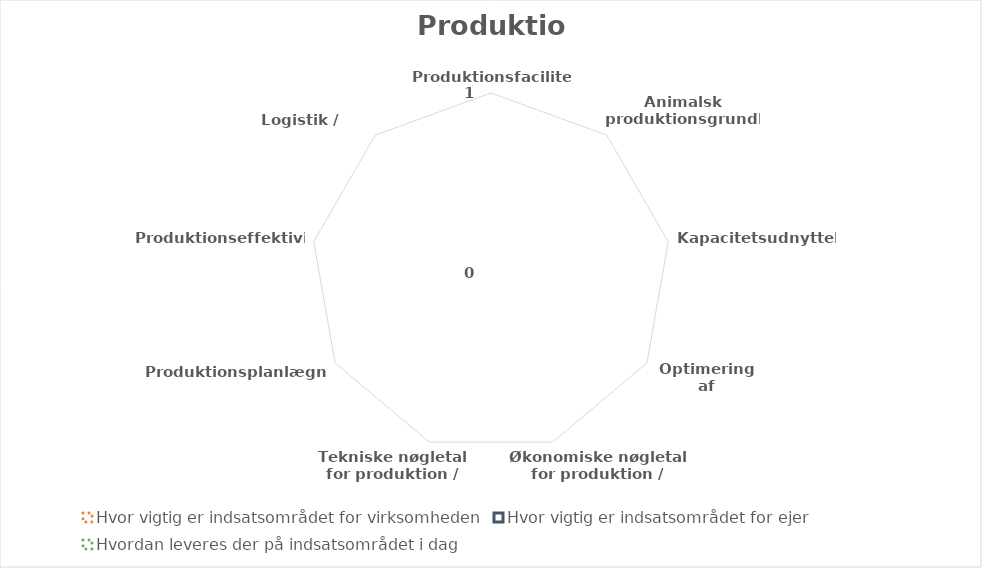
| Category | Hvor vigtig er indsatsområdet for virksomheden | Hvor vigtig er indsatsområdet for ejer | Hvordan leveres der på indsatsområdet i dag |
|---|---|---|---|
| Produktionsfaciliteter | 0 | 0 | 0 |
| Animalsk produktionsgrundlag | 0 | 0 | 0 |
| Kapacitetsudnyttelse | 0 | 0 | 0 |
| Optimering af produktionen | 0 | 0 | 0 |
| Økonomiske nøgletal for produktion / produkt | 0 | 0 | 0 |
| Tekniske nøgletal for produktion / produkt | 0 | 0 | 0 |
| Produktionsplanlægning | 0 | 0 | 0 |
| Produktionseffektivitet | 0 | 0 | 0 |
| Logistik / distribution | 0 | 0 | 0 |